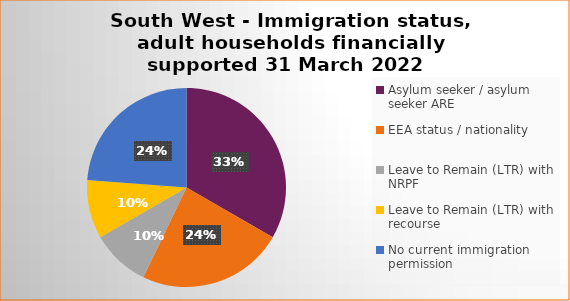
| Category | Number  | Percentage |
|---|---|---|
| Asylum seeker / asylum seeker ARE | 7 | 0.333 |
| EEA status / nationality  | 5 | 0.238 |
| Leave to Remain (LTR) with NRPF | 2 | 0.095 |
| Leave to Remain (LTR) with recourse | 2 | 0.095 |
| No current immigration permission | 5 | 0.238 |